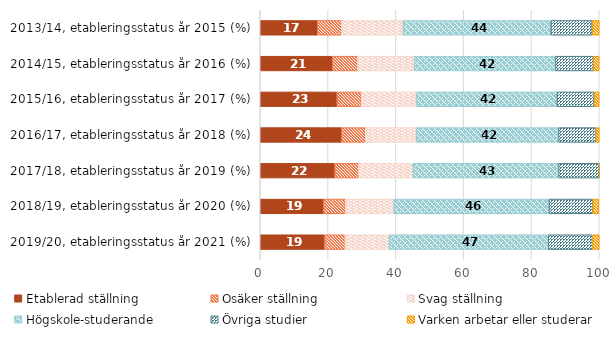
| Category | Etablerad ställning | Osäker ställning | Svag ställning | Högskole-studerande | Övriga studier | Varken arbetar eller studerar |
|---|---|---|---|---|---|---|
| 2019/20, etableringsstatus år 2021 (%) | 19 | 6 | 13 | 47 | 13 | 2 |
| 2018/19, etableringsstatus år 2020 (%) | 18.7 | 6.4 | 14.3 | 45.8 | 12.9 | 1.8 |
| 2017/18, etableringsstatus år 2019 (%) | 22 | 7 | 16 | 43 | 12 | 2 |
| 2016/17, etableringsstatus år 2018 (%) | 24 | 7 | 15 | 42 | 11 | 1 |
| 2015/16, etableringsstatus år 2017 (%) | 22.64 | 7.19 | 16.16 | 41.51 | 10.99 | 1.5 |
| 2014/15, etableringsstatus år 2016 (%) | 21.33 | 7.33 | 16.78 | 41.64 | 11.18 | 1.73 |
| 2013/14, etableringsstatus år 2015 (%) | 16.87 | 7.1 | 18.17 | 43.57 | 12.2 | 2.09 |